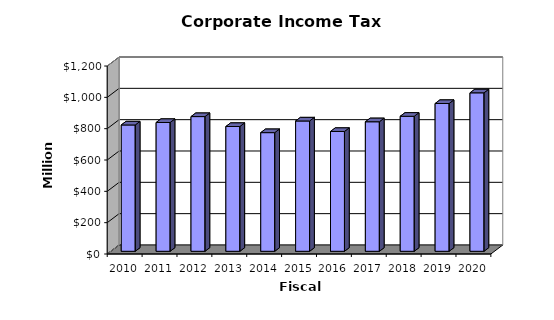
| Category | Amount |
|---|---|
| 2010.0 | 806472760 |
| 2011.0 | 822258802.84 |
| 2012.0 | 859922839.55 |
| 2013.0 | 796728154.4 |
| 2014.0 | 757490742.09 |
| 2015.0 | 831906887.16 |
| 2016.0 | 764948013.77 |
| 2017.0 | 826960822.31 |
| 2018.0 | 861897138.18 |
| 2019.0 | 943390660.95 |
| 2020.0 | 1011649618.07 |